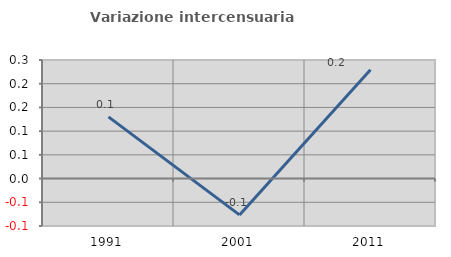
| Category | Variazione intercensuaria annua |
|---|---|
| 1991.0 | 0.13 |
| 2001.0 | -0.077 |
| 2011.0 | 0.229 |